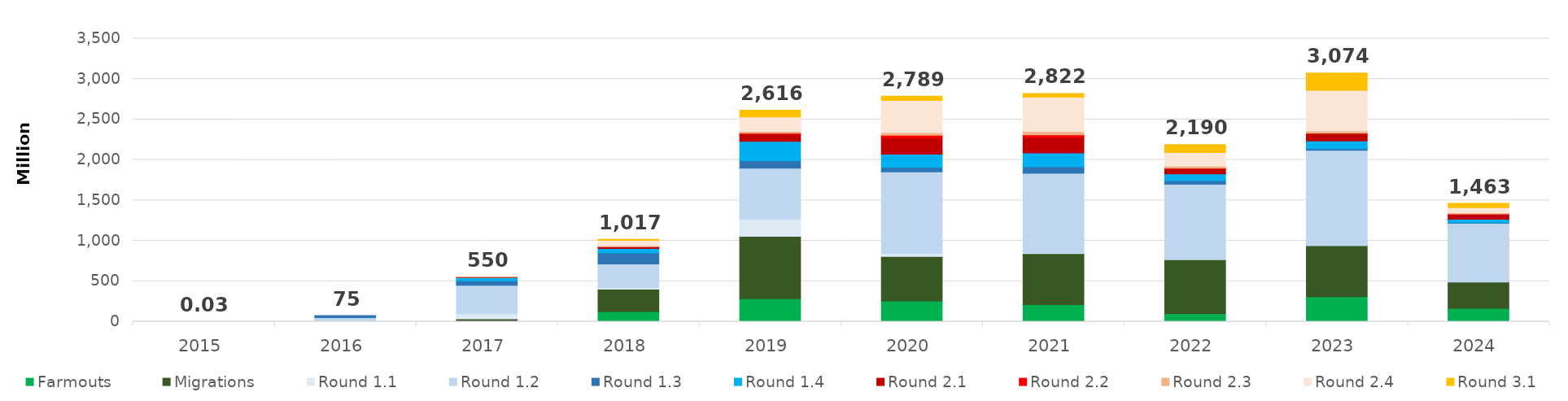
| Category | Farmouts | Migrations | Round 1.1 | Round 1.2 | Round 1.3 | Round 1.4 | Round 2.1 | Round 2.2 | Round 2.3 | Round 2.4 | Round 3.1 |
|---|---|---|---|---|---|---|---|---|---|---|---|
| 2015.0 | 0 | 0 | 0.023 | 0.003 | 0 | 0 | 0 | 0 | 0 | 0 | 0 |
| 2016.0 | 0 | 0 | 7.936 | 41.333 | 25.282 | 0 | 0 | 0 | 0 | 0 | 0 |
| 2017.0 | 2.542 | 33.018 | 63.397 | 349.863 | 56.94 | 42.788 | 0.983 | 0.059 | 0.096 | 0 | 0 |
| 2018.0 | 125.867 | 276.816 | 16.108 | 294.863 | 135.1 | 55.228 | 21.392 | 2.843 | 10.748 | 66.3 | 11.883 |
| 2019.0 | 283.572 | 772.876 | 213.402 | 628.348 | 92.772 | 239.73 | 87.584 | 13.102 | 21.34 | 178.948 | 83.95 |
| 2020.0 | 257.541 | 550.523 | 34.013 | 1011.433 | 55.889 | 161.565 | 200.141 | 33.971 | 33.561 | 396.842 | 53.073 |
| 2021.0 | 210.348 | 631.613 | 8.662 | 983.846 | 81.954 | 170.902 | 191.437 | 32.428 | 39.079 | 425.153 | 46.21 |
| 2022.0 | 100.478 | 669.774 | 0.096 | 930.188 | 44.312 | 81.891 | 69.333 | 2.33 | 24.094 | 170.079 | 97.522 |
| 2023.0 | 309.546 | 630.228 | 0 | 1179.242 | 20.961 | 95.246 | 95.213 | 1.179 | 25.955 | 503.583 | 212.89 |
| 2024.0 | 166.619 | 324.906 | 0 | 725.709 | 6.209 | 43.397 | 64.283 | 2.686 | 12.457 | 63.675 | 52.795 |